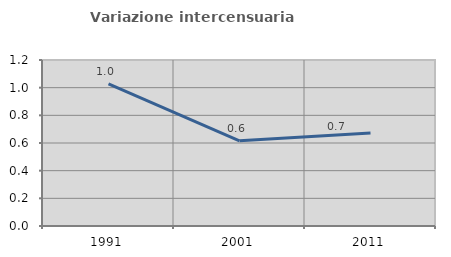
| Category | Variazione intercensuaria annua |
|---|---|
| 1991.0 | 1.028 |
| 2001.0 | 0.616 |
| 2011.0 | 0.672 |